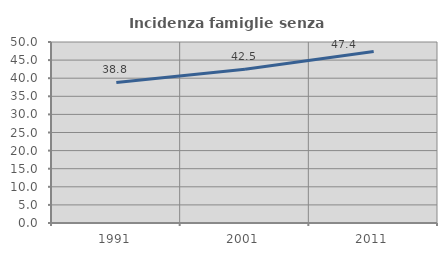
| Category | Incidenza famiglie senza nuclei |
|---|---|
| 1991.0 | 38.839 |
| 2001.0 | 42.478 |
| 2011.0 | 47.391 |